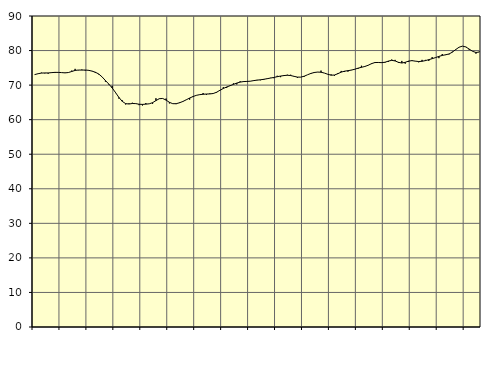
| Category | Piggar | Series 1 |
|---|---|---|
| nan | 73 | 73.04 |
| 87.0 | 73.3 | 73.3 |
| 87.0 | 73.6 | 73.48 |
| 87.0 | 73.4 | 73.52 |
| nan | 73.3 | 73.52 |
| 88.0 | 73.7 | 73.61 |
| 88.0 | 73.5 | 73.69 |
| 88.0 | 73.6 | 73.68 |
| nan | 73.6 | 73.62 |
| 89.0 | 73.5 | 73.55 |
| 89.0 | 73.6 | 73.64 |
| 89.0 | 74.2 | 73.94 |
| nan | 74.7 | 74.25 |
| 90.0 | 74.3 | 74.36 |
| 90.0 | 74.5 | 74.35 |
| 90.0 | 74.2 | 74.36 |
| nan | 74.2 | 74.28 |
| 91.0 | 74.1 | 74.06 |
| 91.0 | 73.5 | 73.73 |
| 91.0 | 73.1 | 73.23 |
| nan | 72.4 | 72.38 |
| 92.0 | 71 | 71.33 |
| 92.0 | 70.2 | 70.31 |
| 92.0 | 69.8 | 69.18 |
| nan | 67.7 | 67.85 |
| 93.0 | 66.1 | 66.44 |
| 93.0 | 65.6 | 65.29 |
| 93.0 | 64.4 | 64.64 |
| nan | 64.7 | 64.53 |
| 94.0 | 64.9 | 64.68 |
| 94.0 | 64.6 | 64.65 |
| 94.0 | 64.2 | 64.46 |
| nan | 64.1 | 64.42 |
| 95.0 | 64.8 | 64.49 |
| 95.0 | 64.6 | 64.59 |
| 95.0 | 64.6 | 64.92 |
| nan | 66.2 | 65.52 |
| 96.0 | 66 | 66.07 |
| 96.0 | 66.1 | 66.13 |
| 96.0 | 66.1 | 65.66 |
| nan | 64.7 | 65.02 |
| 97.0 | 64.6 | 64.62 |
| 97.0 | 64.5 | 64.62 |
| 97.0 | 65 | 64.89 |
| nan | 65.2 | 65.27 |
| 98.0 | 65.8 | 65.75 |
| 98.0 | 65.8 | 66.26 |
| 98.0 | 66.8 | 66.69 |
| nan | 67 | 67.04 |
| 99.0 | 67.2 | 67.24 |
| 99.0 | 67.7 | 67.35 |
| 99.0 | 67.2 | 67.42 |
| nan | 67.6 | 67.45 |
| 0.0 | 67.5 | 67.57 |
| 0.0 | 67.8 | 67.93 |
| 0.0 | 68.4 | 68.51 |
| nan | 69.4 | 69.03 |
| 1.0 | 69.2 | 69.46 |
| 1.0 | 69.9 | 69.82 |
| 1.0 | 70.5 | 70.21 |
| nan | 70.2 | 70.59 |
| 2.0 | 71.1 | 70.87 |
| 2.0 | 70.9 | 71.02 |
| 2.0 | 71.1 | 71.07 |
| nan | 71.1 | 71.13 |
| 3.0 | 71.4 | 71.3 |
| 3.0 | 71.5 | 71.44 |
| 3.0 | 71.4 | 71.54 |
| nan | 71.5 | 71.68 |
| 4.0 | 71.8 | 71.85 |
| 4.0 | 72.1 | 72.04 |
| 4.0 | 72 | 72.22 |
| nan | 72.7 | 72.43 |
| 5.0 | 72.3 | 72.62 |
| 5.0 | 72.9 | 72.76 |
| 5.0 | 73 | 72.85 |
| nan | 73 | 72.77 |
| 6.0 | 72.5 | 72.54 |
| 6.0 | 72.1 | 72.32 |
| 6.0 | 72.3 | 72.31 |
| nan | 72.4 | 72.57 |
| 7.0 | 73 | 72.99 |
| 7.0 | 73.5 | 73.38 |
| 7.0 | 73.5 | 73.65 |
| nan | 73.8 | 73.77 |
| 8.0 | 74.2 | 73.73 |
| 8.0 | 73.5 | 73.49 |
| 8.0 | 73.1 | 73.14 |
| nan | 73.1 | 72.87 |
| 9.0 | 72.7 | 72.92 |
| 9.0 | 73.5 | 73.3 |
| 9.0 | 74.1 | 73.76 |
| nan | 73.8 | 74.03 |
| 10.0 | 73.9 | 74.18 |
| 10.0 | 74.4 | 74.34 |
| 10.0 | 74.5 | 74.59 |
| nan | 74.7 | 74.9 |
| 11.0 | 75.6 | 75.15 |
| 11.0 | 75.3 | 75.39 |
| 11.0 | 75.7 | 75.74 |
| nan | 76.1 | 76.21 |
| 12.0 | 76.4 | 76.53 |
| 12.0 | 76.5 | 76.55 |
| 12.0 | 76.4 | 76.5 |
| nan | 76.5 | 76.62 |
| 13.0 | 76.7 | 76.95 |
| 13.0 | 77.4 | 77.17 |
| 13.0 | 77.3 | 77 |
| nan | 76.4 | 76.59 |
| 14.0 | 77 | 76.39 |
| 14.0 | 76.2 | 76.6 |
| 14.0 | 76.7 | 76.95 |
| nan | 77.2 | 77.08 |
| 15.0 | 76.9 | 76.94 |
| 15.0 | 76.6 | 76.82 |
| 15.0 | 77.3 | 76.9 |
| nan | 77.3 | 77.09 |
| 16.0 | 77 | 77.37 |
| 16.0 | 78.1 | 77.65 |
| 16.0 | 77.9 | 77.96 |
| nan | 77.8 | 78.31 |
| 17.0 | 79 | 78.59 |
| 17.0 | 78.7 | 78.78 |
| 17.0 | 78.9 | 79.01 |
| nan | 79.7 | 79.54 |
| 18.0 | 80.2 | 80.3 |
| 18.0 | 81 | 80.97 |
| 18.0 | 81.3 | 81.28 |
| nan | 81.1 | 81.04 |
| 19.0 | 80.2 | 80.42 |
| 19.0 | 79.8 | 79.78 |
| 19.0 | 79.1 | 79.45 |
| nan | 79.7 | 79.57 |